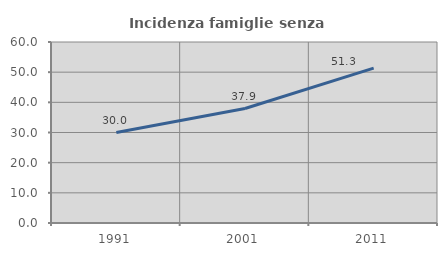
| Category | Incidenza famiglie senza nuclei |
|---|---|
| 1991.0 | 30 |
| 2001.0 | 37.945 |
| 2011.0 | 51.327 |